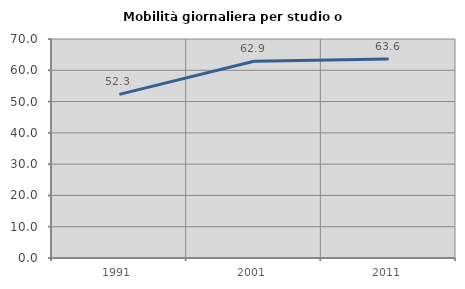
| Category | Mobilità giornaliera per studio o lavoro |
|---|---|
| 1991.0 | 52.299 |
| 2001.0 | 62.885 |
| 2011.0 | 63.636 |